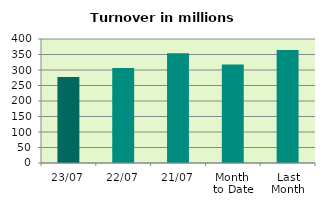
| Category | Series 0 |
|---|---|
| 23/07 | 277.037 |
| 22/07 | 306.323 |
| 21/07 | 354.284 |
| Month 
to Date | 317.861 |
| Last
Month | 364.182 |